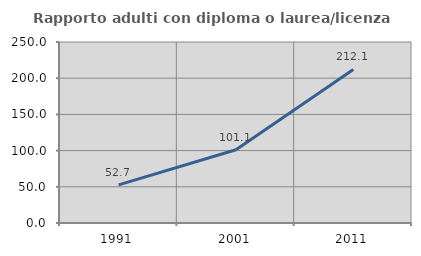
| Category | Rapporto adulti con diploma o laurea/licenza media  |
|---|---|
| 1991.0 | 52.707 |
| 2001.0 | 101.104 |
| 2011.0 | 212.077 |